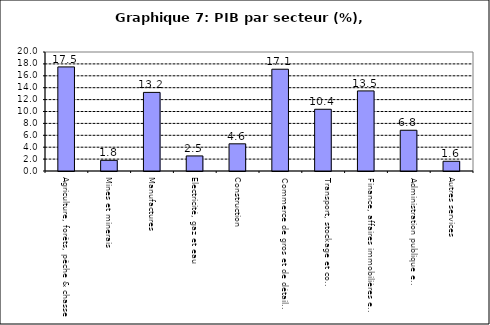
| Category | Series 0 |
|---|---|
| Agriculture, forêts, pêche & chasse | 17.493 |
| Mines et minerais | 1.796 |
| Manufactures | 13.211 |
| Electricité, gaz et eau | 2.533 |
| Construction | 4.569 |
| Commerce de gros et de détail, hôtels et restaurants | 17.105 |
| Transport, stockage et communications                | 10.375 |
| Finance, affaires immobilières et services | 13.461 |
| Administration publique et defense       | 6.849 |
| Autres services                        | 1.634 |